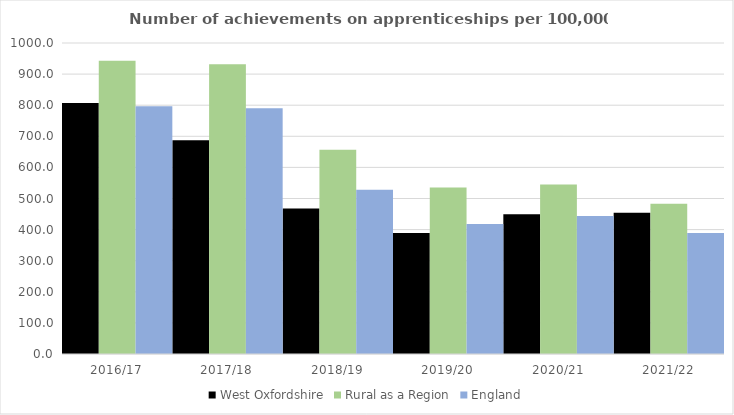
| Category | West Oxfordshire | Rural as a Region | England |
|---|---|---|---|
| 2016/17 | 807 | 942.594 | 797 |
| 2017/18 | 687 | 931.709 | 790 |
| 2018/19 | 468 | 656.44 | 528 |
| 2019/20 | 389 | 535.552 | 418 |
| 2020/21 | 449 | 545.333 | 444 |
| 2021/22 | 454 | 482.936 | 389 |